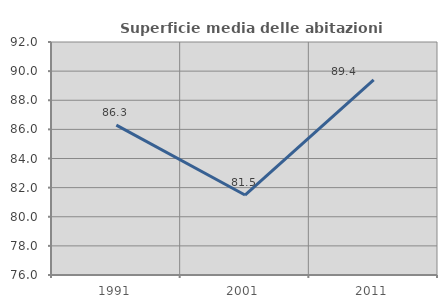
| Category | Superficie media delle abitazioni occupate |
|---|---|
| 1991.0 | 86.289 |
| 2001.0 | 81.491 |
| 2011.0 | 89.4 |